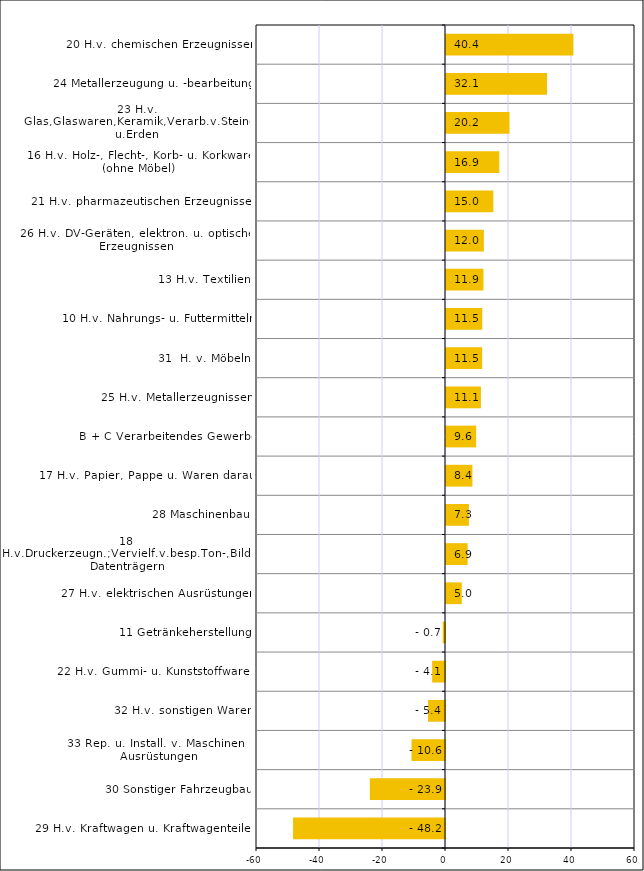
| Category | Series 0 |
|---|---|
| 29 H.v. Kraftwagen u. Kraftwagenteilen | -48.239 |
| 30 Sonstiger Fahrzeugbau | -23.86 |
| 33 Rep. u. Install. v. Maschinen u. Ausrüstungen | -10.623 |
| 32 H.v. sonstigen Waren | -5.39 |
| 22 H.v. Gummi- u. Kunststoffwaren | -4.086 |
| 11 Getränkeherstellung | -0.71 |
| 27 H.v. elektrischen Ausrüstungen | 5.006 |
| 18 H.v.Druckerzeugn.;Vervielf.v.besp.Ton-,Bild-u.Datenträgern | 6.875 |
| 28 Maschinenbau | 7.262 |
| 17 H.v. Papier, Pappe u. Waren daraus | 8.381 |
| B + C Verarbeitendes Gewerbe | 9.57 |
| 25 H.v. Metallerzeugnissen | 11.085 |
| 31  H. v. Möbeln | 11.488 |
| 10 H.v. Nahrungs- u. Futtermitteln | 11.509 |
| 13 H.v. Textilien | 11.892 |
| 26 H.v. DV-Geräten, elektron. u. optischen Erzeugnissen | 12.03 |
| 21 H.v. pharmazeutischen Erzeugnissen | 15.024 |
| 16 H.v. Holz-, Flecht-, Korb- u. Korkwaren (ohne Möbel) | 16.921 |
| 23 H.v. Glas,Glaswaren,Keramik,Verarb.v.Steinen u.Erden | 20.153 |
| 24 Metallerzeugung u. -bearbeitung | 32.076 |
| 20 H.v. chemischen Erzeugnissen | 40.44 |